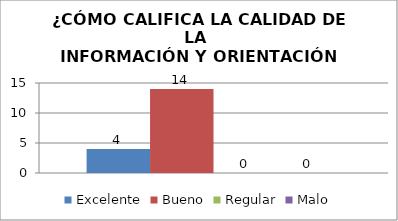
| Category | Excelente | Bueno | Regular | Malo |
|---|---|---|---|---|
| 0 | 4 | 14 | 0 | 0 |